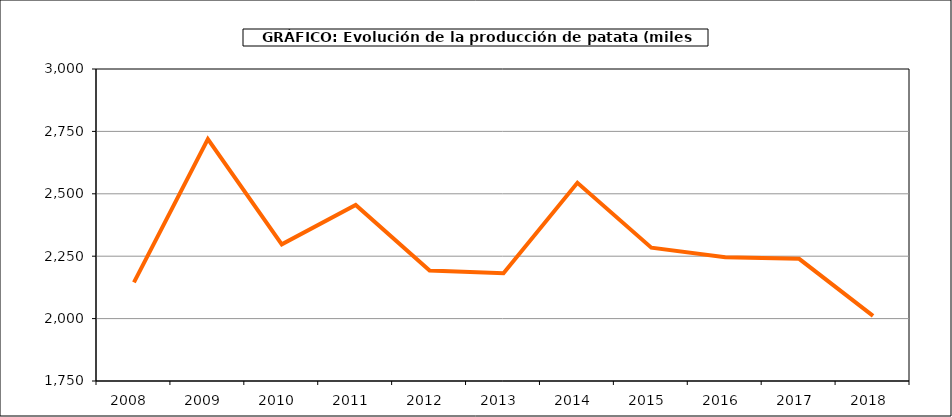
| Category | Producción |
|---|---|
| 2008.0 | 2145.171 |
| 2009.0 | 2719.291 |
| 2010.0 | 2297.649 |
| 2011.0 | 2455.101 |
| 2012.0 | 2192.284 |
| 2013.0 | 2182.082 |
| 2014.0 | 2544.009 |
| 2015.0 | 2284.073 |
| 2016.0 | 2246.204 |
| 2017.0 | 2239.47 |
| 2018.0 | 2010.933 |